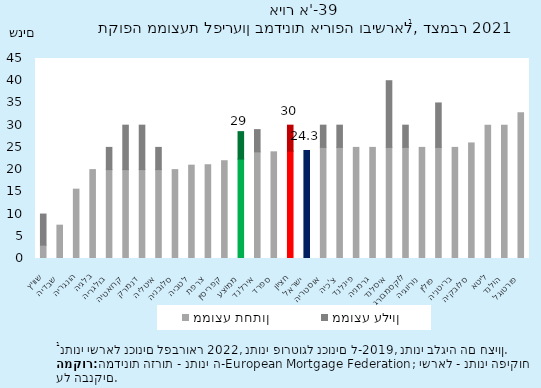
| Category | ממוצע תחתון | ממוצע עליון |
|---|---|---|
| שוויץ | 3 | 7 |
| שבדיה | 7.5 | 0 |
| הונגריה | 15.6 | 0 |
| בלגיה | 20 | 0 |
| בולגריה | 20 | 5 |
| קרואטיה | 20 | 10 |
| דנמרק | 20 | 10 |
| איטליה | 20 | 5 |
| סלובניה | 20 | 0 |
| לטביה | 21 | 0 |
| צרפת | 21.1 | 0 |
| קפריסין | 22 | 0 |
| ממוצע | 22.368 | 6.178 |
| אירלנד | 24 | 5 |
| ספרד | 24 | 0 |
| חציון | 24.15 | 5.85 |
| ישראל | 24.3 | 0 |
| אוסטריה | 25 | 5 |
| צ'כיה | 25 | 5 |
| פינלנד | 25 | 0 |
| גרמניה | 25 | 0 |
| איסלנד | 25 | 15 |
| לוקסמבורג | 25 | 5 |
| נורווגיה | 25 | 0 |
| פולין | 25 | 10 |
| בריטניה | 25 | 0 |
| סלובקיה | 26 | 0 |
| ליטא | 30 | 0 |
| הולנד | 30 | 0 |
| פורטוגל | 32.8 | 0 |